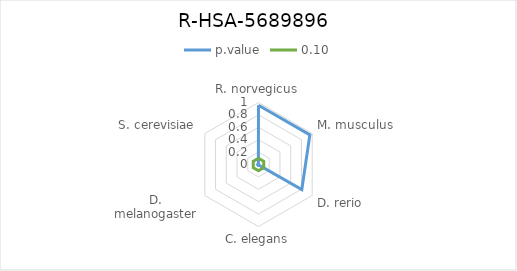
| Category | p.value | 0.10 |
|---|---|---|
| R. norvegicus | 0.956 | 0.1 |
| M. musculus | 0.956 | 0.1 |
| D. rerio | 0.807 | 0.1 |
| C. elegans | 0.007 | 0.1 |
| D. melanogaster | 0.033 | 0.1 |
| S. cerevisiae | 0.002 | 0.1 |